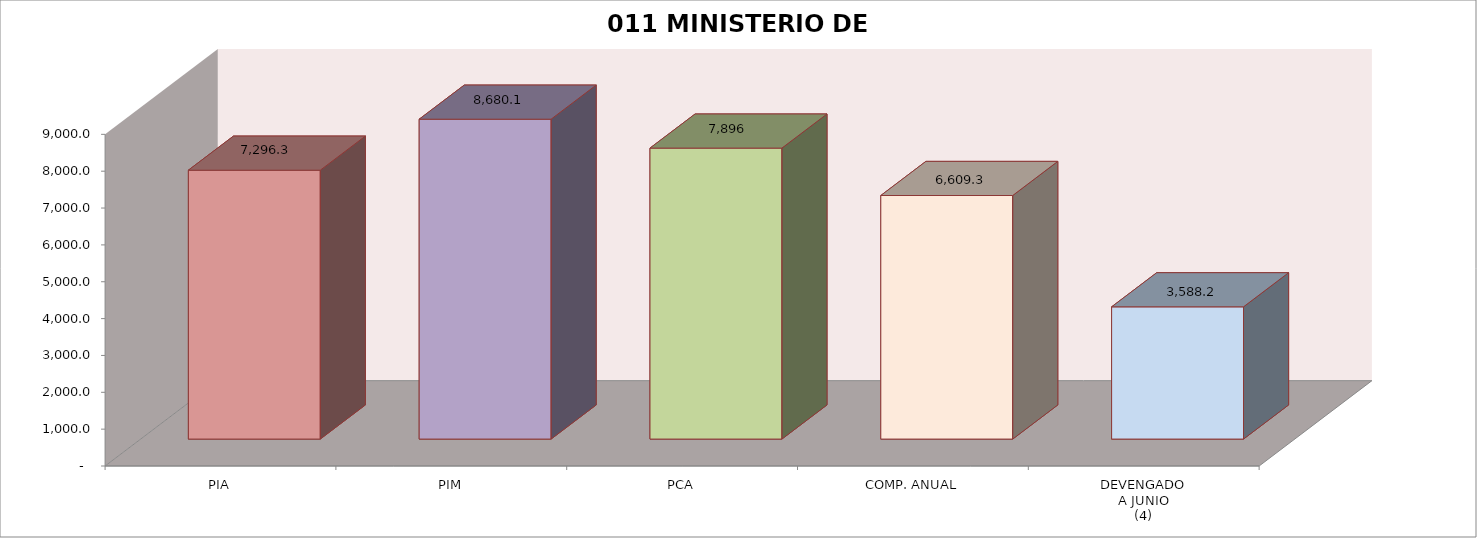
| Category | 011 MINISTERIO DE SALUD |
|---|---|
| PIA | 7296.309 |
| PIM | 8680.054 |
| PCA | 7895.542 |
| COMP. ANUAL | 6609.349 |
| DEVENGADO
A JUNIO
(4) | 3588.207 |